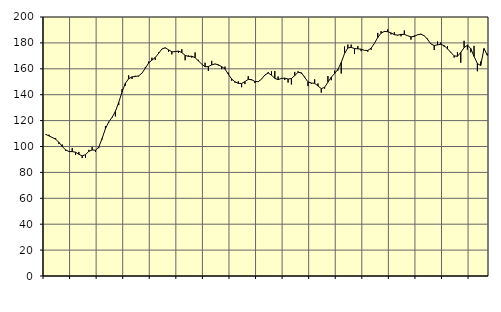
| Category | Piggar | Series 1 |
|---|---|---|
| nan | 109.1 | 109.36 |
| 87.0 | 109.1 | 108.2 |
| 87.0 | 106.6 | 106.95 |
| 87.0 | 106.4 | 105.59 |
| nan | 101.9 | 103.23 |
| 88.0 | 101.5 | 100 |
| 88.0 | 96.8 | 97.39 |
| 88.0 | 96 | 96.13 |
| nan | 98.8 | 96.05 |
| 89.0 | 93.4 | 95.6 |
| 89.0 | 95.8 | 94 |
| 89.0 | 91.1 | 92.74 |
| nan | 91.4 | 93.73 |
| 90.0 | 97.4 | 96.26 |
| 90.0 | 99.6 | 97.35 |
| 90.0 | 95.8 | 97.05 |
| nan | 98.7 | 99.54 |
| 91.0 | 105.5 | 106.22 |
| 91.0 | 115.7 | 113.7 |
| 91.0 | 118.4 | 119.02 |
| nan | 122.8 | 122.49 |
| 92.0 | 123.2 | 127.15 |
| 92.0 | 132 | 134.08 |
| 92.0 | 144.3 | 142.15 |
| nan | 147 | 148.83 |
| 93.0 | 154.9 | 152.35 |
| 93.0 | 152.2 | 153.77 |
| 93.0 | 154.6 | 154.04 |
| nan | 154.1 | 154.56 |
| 94.0 | 156.5 | 156.63 |
| 94.0 | 161.2 | 160.48 |
| 94.0 | 165.6 | 164.4 |
| nan | 168.6 | 166.68 |
| 95.0 | 166.9 | 168.72 |
| 95.0 | 172.6 | 171.88 |
| 95.0 | 175.2 | 175.32 |
| nan | 175.9 | 176.26 |
| 96.0 | 173.1 | 174.65 |
| 96.0 | 171.1 | 173.14 |
| 96.0 | 173.6 | 173.24 |
| nan | 172.2 | 173.7 |
| 97.0 | 175.1 | 172.51 |
| 97.0 | 166.6 | 170.37 |
| 97.0 | 170.3 | 169.58 |
| nan | 168.6 | 169.73 |
| 98.0 | 172.6 | 168.59 |
| 98.0 | 166.9 | 166.14 |
| 98.0 | 163.7 | 163.56 |
| nan | 164.7 | 161.59 |
| 99.0 | 158.3 | 161.73 |
| 99.0 | 166.1 | 163.03 |
| 99.0 | 163.6 | 163.77 |
| nan | 162.6 | 163.07 |
| 0.0 | 159.7 | 161.71 |
| 0.0 | 161.7 | 159.82 |
| 0.0 | 157 | 155.83 |
| nan | 150.8 | 152.11 |
| 1.0 | 149.3 | 150.02 |
| 1.0 | 150.3 | 148.8 |
| 1.0 | 145.8 | 148.66 |
| nan | 148.2 | 150.12 |
| 2.0 | 154.3 | 151.82 |
| 2.0 | 151.2 | 151.65 |
| 2.0 | 149 | 150.24 |
| nan | 150.1 | 150.01 |
| 3.0 | 152.2 | 151.98 |
| 3.0 | 155 | 155.21 |
| 3.0 | 157.4 | 156.74 |
| nan | 158.1 | 155.14 |
| 4.0 | 158.3 | 152.58 |
| 4.0 | 154.1 | 151.64 |
| 4.0 | 152.8 | 152.55 |
| nan | 151.4 | 152.81 |
| 5.0 | 149.4 | 152.07 |
| 5.0 | 147.9 | 152.5 |
| 5.0 | 157.6 | 154.77 |
| nan | 158.1 | 157.28 |
| 6.0 | 156.2 | 156.93 |
| 6.0 | 153.9 | 153.37 |
| 6.0 | 146.6 | 149.91 |
| nan | 148.5 | 149.02 |
| 7.0 | 151.9 | 148.78 |
| 7.0 | 148.7 | 146.77 |
| 7.0 | 141.6 | 144.7 |
| nan | 144.7 | 145.69 |
| 8.0 | 154.4 | 149.66 |
| 8.0 | 151.2 | 153.49 |
| 8.0 | 158.5 | 156.39 |
| nan | 158.6 | 159.51 |
| 9.0 | 156.3 | 164.88 |
| 9.0 | 177.2 | 171.81 |
| 9.0 | 178.7 | 176.12 |
| nan | 178.7 | 176.51 |
| 10.0 | 171.4 | 175.66 |
| 10.0 | 177.5 | 175.38 |
| 10.0 | 173.6 | 175.16 |
| nan | 174.2 | 174.24 |
| 11.0 | 173.2 | 174.18 |
| 11.0 | 174.7 | 175.94 |
| 11.0 | 179.5 | 179.66 |
| nan | 187.7 | 184.21 |
| 12.0 | 189.1 | 187.51 |
| 12.0 | 188.4 | 188.88 |
| 12.0 | 190.4 | 188.64 |
| nan | 186.6 | 187.69 |
| 13.0 | 188.2 | 186.37 |
| 13.0 | 185.6 | 185.97 |
| 13.0 | 185.1 | 186.58 |
| nan | 189.6 | 186.59 |
| 14.0 | 185.7 | 185.56 |
| 14.0 | 182.5 | 184.61 |
| 14.0 | 185.7 | 185.04 |
| nan | 186.1 | 186.28 |
| 15.0 | 187 | 186.72 |
| 15.0 | 185.4 | 185.58 |
| 15.0 | 183.3 | 182.67 |
| nan | 179.4 | 179.21 |
| 16.0 | 174.5 | 177.98 |
| 16.0 | 181.1 | 178.48 |
| 16.0 | 180.4 | 178.93 |
| nan | 177 | 177.87 |
| 17.0 | 177.5 | 175.43 |
| 17.0 | 172.4 | 172.68 |
| 17.0 | 168.7 | 169.99 |
| nan | 172.8 | 169.64 |
| 18.0 | 164.7 | 172.65 |
| 18.0 | 181.6 | 176.35 |
| 18.0 | 174.8 | 178.25 |
| nan | 172.7 | 175.7 |
| 19.0 | 177.7 | 169.55 |
| 19.0 | 158.1 | 164.06 |
| 19.0 | 165.6 | 162.53 |
| nan | 174.4 | 175.66 |
| 20.0 | 171.6 | 170.41 |